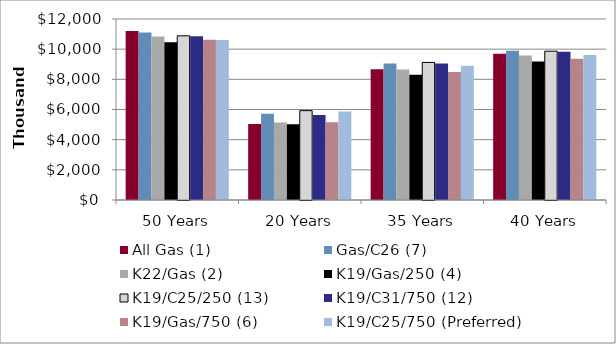
| Category | All Gas (1) | Gas/C26 (7) | K22/Gas (2) | K19/Gas/250 (4) | K19/C25/250 (13) | K19/C31/750 (12) | K19/Gas/750 (6) | K19/C25/750 (Preferred) |
|---|---|---|---|---|---|---|---|---|
| 50 Years | 11208.741 | 11107.73 | 10834.066 | 10452.176 | 10885.939 | 10861.063 | 10627.389 | 10605.468 |
| 20 Years | 5034.127 | 5724.973 | 5137.886 | 5023.426 | 5922.422 | 5628.02 | 5146.628 | 5875.164 |
| 35 Years | 8670.228 | 9049.952 | 8655.153 | 8300.533 | 9120.583 | 9051.451 | 8482.561 | 8900.861 |
| 40 Years | 9693.16 | 9893.379 | 9577.14 | 9186.464 | 9865.086 | 9822.48 | 9370.699 | 9620.335 |